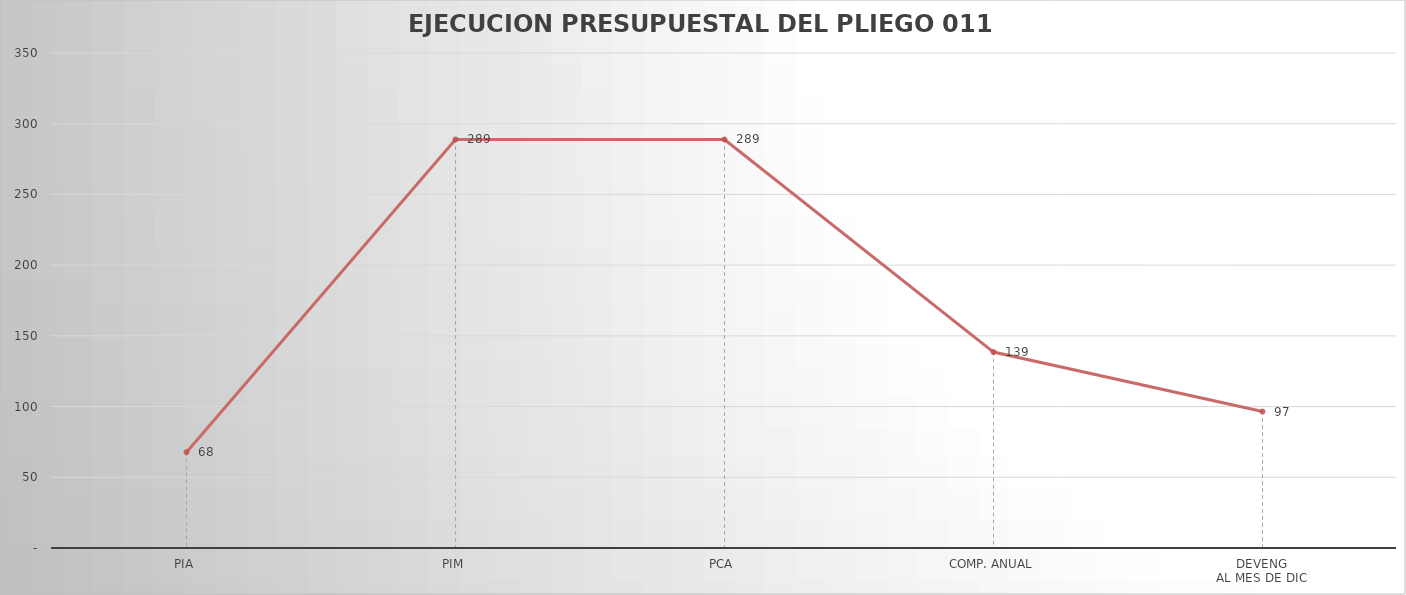
| Category | Series 0 |
|---|---|
| PIA | 67.768 |
| PIM | 288.845 |
| PCA | 288.845 |
| COMP. ANUAL | 138.536 |
| DEVENG
AL MES DE DIC | 96.509 |